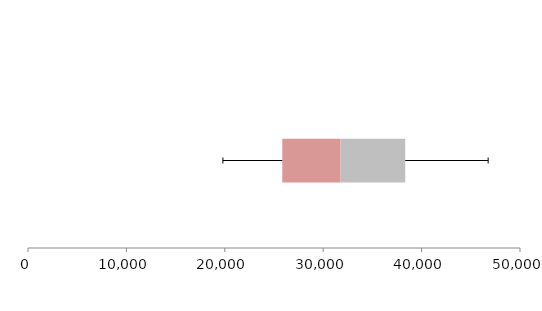
| Category | Series 1 | Series 2 | Series 3 |
|---|---|---|---|
| 0 | 25844.306 | 5916.66 | 6575.842 |